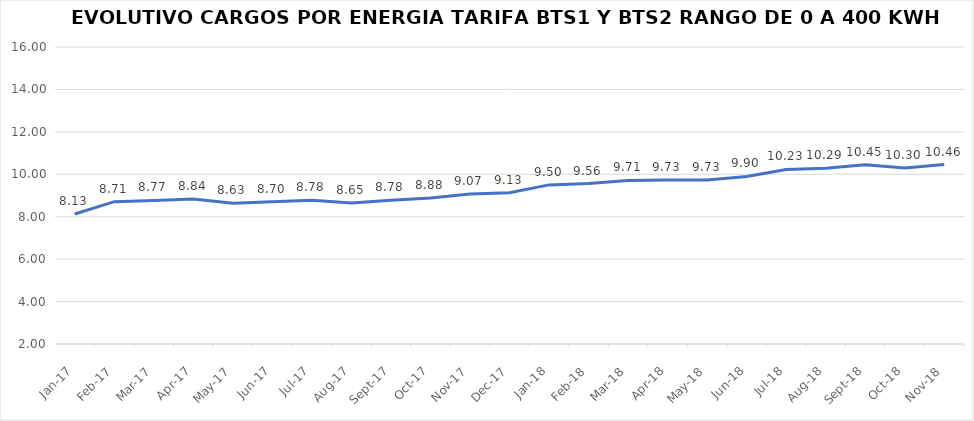
| Category | Series 0 |
|---|---|
| 2017-01-01 | 8.13 |
| 2017-02-01 | 8.71 |
| 2017-03-01 | 8.77 |
| 2017-04-01 | 8.84 |
| 2017-05-01 | 8.63 |
| 2017-06-01 | 8.7 |
| 2017-07-01 | 8.78 |
| 2017-08-01 | 8.65 |
| 2017-09-01 | 8.78 |
| 2017-10-01 | 8.88 |
| 2017-11-01 | 9.07 |
| 2017-12-01 | 9.13 |
| 2018-01-01 | 9.5 |
| 2018-02-01 | 9.56 |
| 2018-03-01 | 9.71 |
| 2018-04-01 | 9.73 |
| 2018-05-01 | 9.73 |
| 2018-06-01 | 9.9 |
| 2018-07-01 | 10.23 |
| 2018-08-01 | 10.29 |
| 2018-09-01 | 10.45 |
| 2018-10-01 | 10.3 |
| 2018-11-01 | 10.46 |